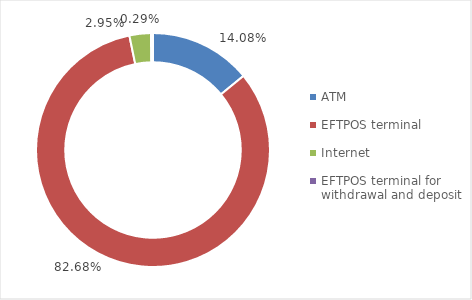
| Category | Series 0 |
|---|---|
| ATM | 4765690 |
| EFTPOS terminal | 27982858 |
| Internet | 998958 |
| EFTPOS terminal for withdrawal and deposit | 97653 |